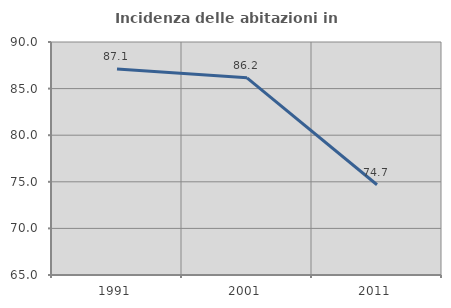
| Category | Incidenza delle abitazioni in proprietà  |
|---|---|
| 1991.0 | 87.111 |
| 2001.0 | 86.156 |
| 2011.0 | 74.686 |